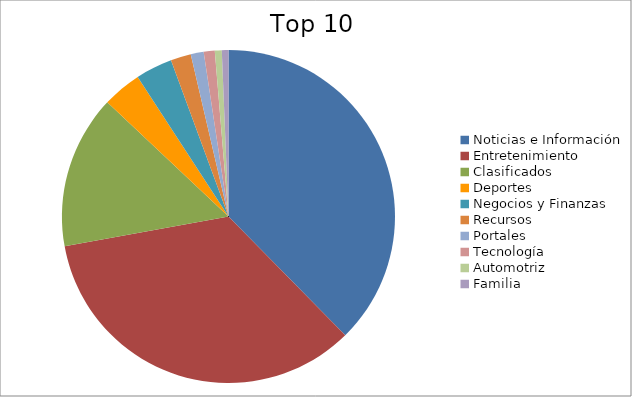
| Category | Series 0 |
|---|---|
| Noticias e Información | 36.89 |
| Entretenimiento | 33.83 |
| Clasificados | 14.58 |
| Deportes | 3.72 |
| Negocios y Finanzas | 3.5 |
| Recursos | 1.93 |
| Portales | 1.23 |
| Tecnología | 1.05 |
| Automotriz | 0.66 |
| Familia | 0.63 |